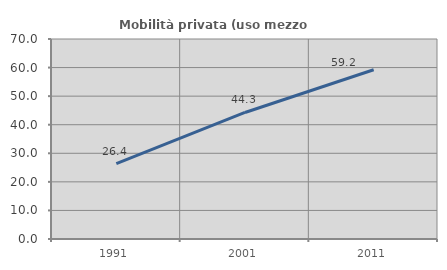
| Category | Mobilità privata (uso mezzo privato) |
|---|---|
| 1991.0 | 26.38 |
| 2001.0 | 44.286 |
| 2011.0 | 59.236 |